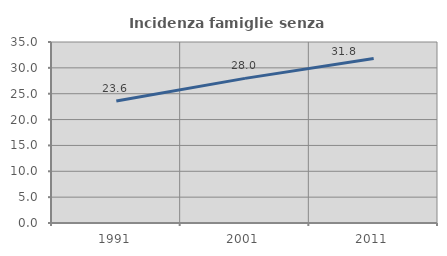
| Category | Incidenza famiglie senza nuclei |
|---|---|
| 1991.0 | 23.599 |
| 2001.0 | 27.966 |
| 2011.0 | 31.79 |